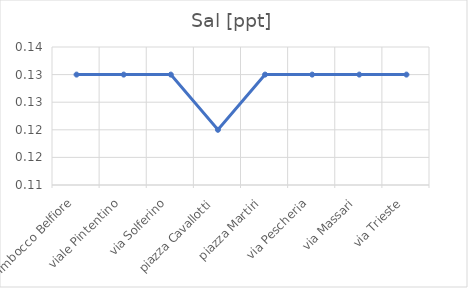
| Category | Sal [ppt] |
|---|---|
| Imbocco Belfiore | 0.13 |
| viale Pintentino | 0.13 |
| via Solferino | 0.13 |
| piazza Cavallotti | 0.12 |
| piazza Martiri | 0.13 |
| via Pescheria | 0.13 |
| via Massari | 0.13 |
| via Trieste | 0.13 |